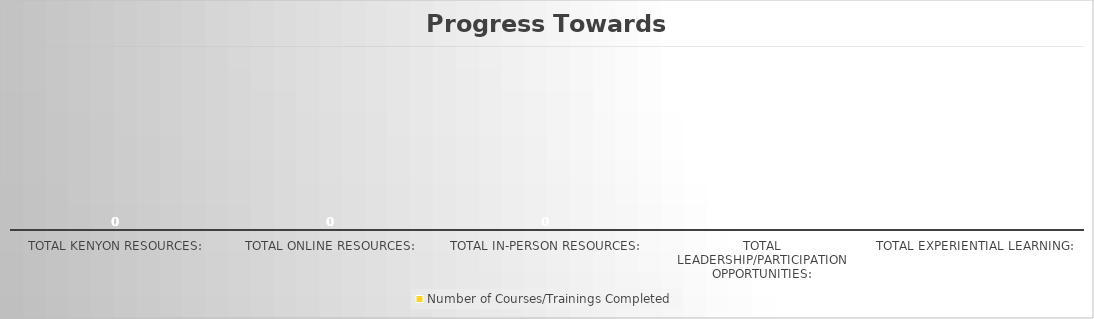
| Category | Number of Courses/Trainings Completed |
|---|---|
| Total Kenyon Resources: | 0 |
| Total Online Resources: | 0 |
| Total In-Person Resources: | 0 |
| Total Leadership/Participation Opportunities: | 0 |
| Total Experiential Learning: | 0 |